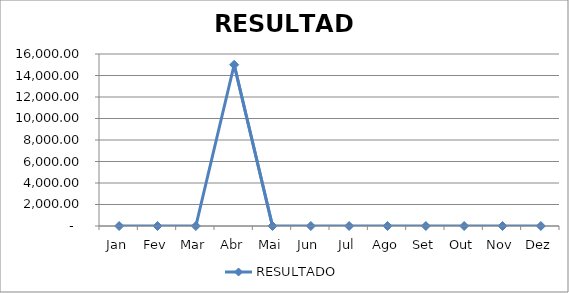
| Category | RESULTADO |
|---|---|
|  Jan  | 0 |
|  Fev  | 0 |
|  Mar  | 0 |
|  Abr  | 15000 |
|  Mai  | 0 |
|  Jun  | 0 |
|  Jul  | 0 |
|  Ago  | 0 |
|  Set  | 0 |
|  Out  | 0 |
|  Nov  | 0 |
|  Dez  | 0 |